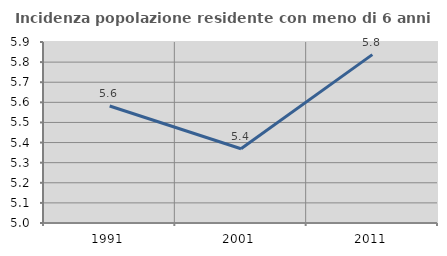
| Category | Incidenza popolazione residente con meno di 6 anni |
|---|---|
| 1991.0 | 5.582 |
| 2001.0 | 5.369 |
| 2011.0 | 5.837 |